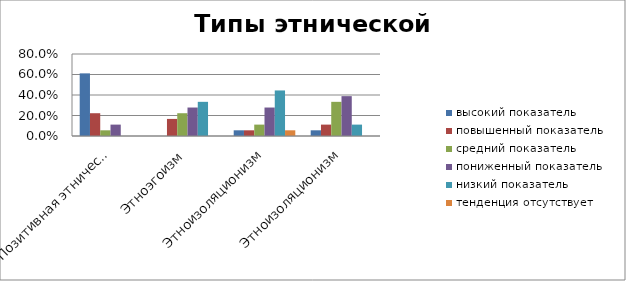
| Category | высокий показатель | повышенный показатель | средний показатель | пониженный показатель | низкий показатель | тенденция отсутствует |
|---|---|---|---|---|---|---|
| Позитивная этническая идентичность | 0.611 | 0.222 | 0.056 | 0.111 | 0 | 0 |
| Этноэгоизм | 0 | 0.167 | 0.222 | 0.278 | 0.333 | 0 |
| Этноизоляционизм | 0.056 | 0.056 | 0.111 | 0.278 | 0.444 | 0.056 |
| Этноизоляционизм | 0.056 | 0.111 | 0.333 | 0.389 | 0.111 | 0 |